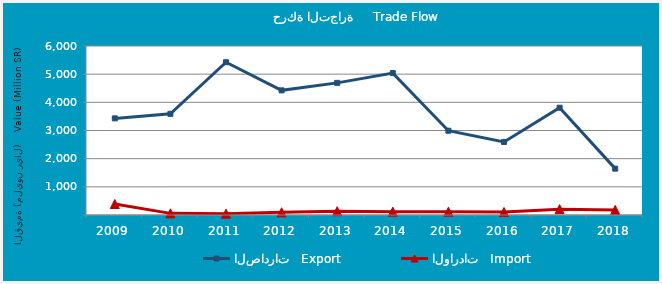
| Category | الصادرات   Export | الواردات   Import |
|---|---|---|
| 2009.0 | 3430251868 | 390136422 |
| 2010.0 | 3591405356 | 58270163 |
| 2011.0 | 5424060210 | 48634845 |
| 2012.0 | 4425067386 | 96600568 |
| 2013.0 | 4691130544 | 135547500 |
| 2014.0 | 5038435503 | 119705124 |
| 2015.0 | 2991788374 | 117659780 |
| 2016.0 | 2593057062 | 107881757 |
| 2017.0 | 3808456029 | 208276725 |
| 2018.0 | 1646125923 | 181573956 |